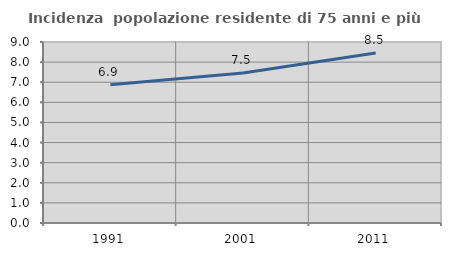
| Category | Incidenza  popolazione residente di 75 anni e più |
|---|---|
| 1991.0 | 6.874 |
| 2001.0 | 7.459 |
| 2011.0 | 8.454 |